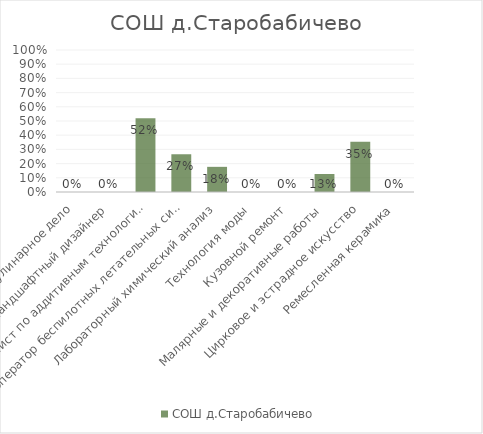
| Category | СОШ д.Старобабичево |
|---|---|
| Кулинарное дело | 0 |
| Ландшафтный дизайнер | 0 |
| Специалист по аддитивным технологиям | 0.519 |
| Оператор беспилотных летательных систем | 0.266 |
| Лабораторный химический анализ | 0.177 |
| Технология моды | 0 |
| Кузовной ремонт | 0 |
| Малярные и декоративные работы | 0.127 |
| Цирковое и эстрадное искусство | 0.354 |
| Ремесленная керамика | 0 |